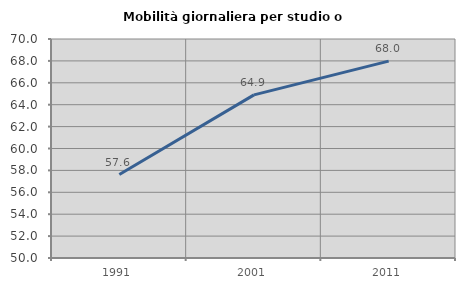
| Category | Mobilità giornaliera per studio o lavoro |
|---|---|
| 1991.0 | 57.623 |
| 2001.0 | 64.898 |
| 2011.0 | 67.979 |